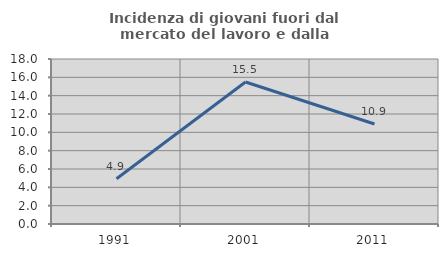
| Category | Incidenza di giovani fuori dal mercato del lavoro e dalla formazione  |
|---|---|
| 1991.0 | 4.93 |
| 2001.0 | 15.487 |
| 2011.0 | 10.909 |